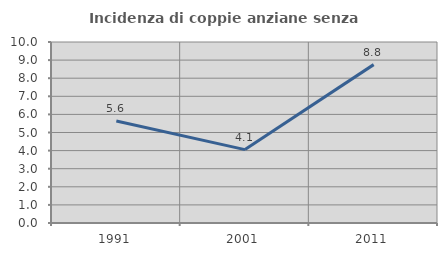
| Category | Incidenza di coppie anziane senza figli  |
|---|---|
| 1991.0 | 5.634 |
| 2001.0 | 4.054 |
| 2011.0 | 8.75 |